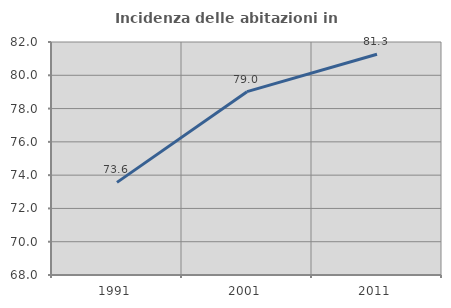
| Category | Incidenza delle abitazioni in proprietà  |
|---|---|
| 1991.0 | 73.565 |
| 2001.0 | 79.016 |
| 2011.0 | 81.267 |